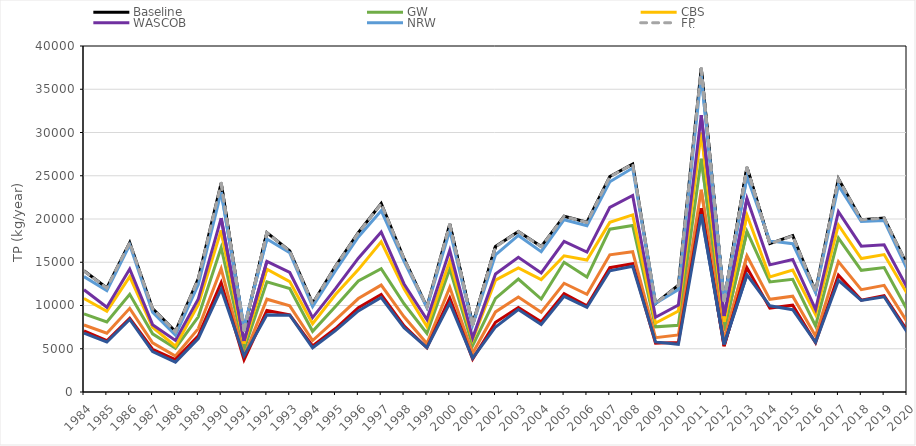
| Category | Baseline | GW | CBS | WASCOB | NRW | FP | GW + CBS | GW + CBS + WASCOB | All ACPs |
|---|---|---|---|---|---|---|---|---|---|
| 1984.0 | 14010 | 9039 | 10810 | 11820 | 13340 | 13980 | 7742 | 7065 | 6810 |
| 1985.0 | 12020 | 8093 | 9334 | 9793 | 11710 | 12010 | 6803 | 5930 | 5781 |
| 1986.0 | 17280 | 11290 | 13340 | 14220 | 17010 | 17270 | 9673 | 8518 | 8387 |
| 1987.0 | 9638 | 6727 | 7483 | 7781 | 9219 | 9616 | 5691 | 4943 | 4678 |
| 1988.0 | 6975 | 5066 | 5292 | 5964 | 6562 | 6956 | 4160 | 3754 | 3452 |
| 1989.0 | 13100 | 8697 | 10100 | 10750 | 12420 | 13070 | 7329 | 6490 | 6171 |
| 1990.0 | 24150 | 16700 | 18690 | 20100 | 23130 | 24120 | 14250 | 12640 | 11890 |
| 1991.0 | 7131 | 4880 | 5572 | 5904 | 7473 | 7137 | 4134 | 3717 | 4168 |
| 1992.0 | 18430 | 12740 | 14200 | 15100 | 17690 | 18400 | 10730 | 9420 | 8922 |
| 1993.0 | 16300 | 11960 | 12760 | 13820 | 16090 | 16280 | 9958 | 8925 | 8885 |
| 1994.0 | 10240 | 7014 | 7889 | 8604 | 9888 | 10220 | 5950 | 5333 | 5116 |
| 1995.0 | 14540 | 9875 | 11270 | 11950 | 14020 | 14510 | 8327 | 7335 | 7100 |
| 1996.0 | 18420 | 12840 | 14150 | 15470 | 17920 | 18390 | 10800 | 9740 | 9375 |
| 1997.0 | 21790 | 14260 | 17360 | 18500 | 20960 | 21770 | 12360 | 11270 | 10920 |
| 1998.0 | 15410 | 10200 | 11930 | 12490 | 15110 | 15390 | 8690 | 7643 | 7444 |
| 1999.0 | 9836 | 6784 | 7563 | 8385 | 9765 | 9836 | 5597 | 5112 | 5143 |
| 2000.0 | 19410 | 14250 | 15130 | 16380 | 18690 | 19370 | 12100 | 10870 | 10280 |
| 2001.0 | 7782 | 5372 | 6044 | 6259 | 7726 | 7784 | 4478 | 3812 | 3916 |
| 2002.0 | 16820 | 10830 | 12930 | 13640 | 15850 | 16770 | 9257 | 8066 | 7518 |
| 2003.0 | 18560 | 13060 | 14340 | 15570 | 18100 | 18540 | 10980 | 9766 | 9525 |
| 2004.0 | 16810 | 10750 | 13000 | 13760 | 16220 | 16790 | 9218 | 8118 | 7799 |
| 2005.0 | 20310 | 15000 | 15750 | 17410 | 19920 | 20300 | 12570 | 11360 | 11050 |
| 2006.0 | 19630 | 13290 | 15260 | 16170 | 19220 | 19610 | 11300 | 9975 | 9786 |
| 2007.0 | 24910 | 18820 | 19610 | 21350 | 24300 | 24880 | 15860 | 14370 | 14010 |
| 2008.0 | 26340 | 19250 | 20470 | 22720 | 25890 | 26330 | 16210 | 14820 | 14530 |
| 2009.0 | 10230 | 7538 | 7964 | 8636 | 10250 | 10220 | 6278 | 5628 | 5793 |
| 2010.0 | 12340 | 7708 | 9366 | 10060 | 11850 | 12310 | 6598 | 5732 | 5507 |
| 2011.0 | 37420 | 26960 | 29980 | 32000 | 36580 | 37400 | 23390 | 21230 | 20540 |
| 2012.0 | 10550 | 7126 | 8131 | 8781 | 10630 | 10550 | 6002 | 5301 | 5503 |
| 2013.0 | 25960 | 18560 | 20460 | 22370 | 24890 | 25930 | 15740 | 14360 | 13550 |
| 2014.0 | 17150 | 12720 | 13300 | 14700 | 17470 | 17140 | 10710 | 9699 | 9968 |
| 2015.0 | 18080 | 13030 | 14100 | 15320 | 17140 | 18040 | 11080 | 10040 | 9516 |
| 2016.0 | 11630 | 7645 | 8942 | 9540 | 11490 | 11610 | 6478 | 5692 | 5738 |
| 2017.0 | 24650 | 17800 | 19310 | 20840 | 23880 | 24620 | 15080 | 13500 | 12900 |
| 2018.0 | 19920 | 14070 | 15430 | 16860 | 19720 | 19910 | 11830 | 10620 | 10580 |
| 2019.0 | 20110 | 14390 | 15890 | 17030 | 19820 | 20100 | 12330 | 11150 | 11010 |
| 2020.0 | 14730 | 9528 | 11410 | 12110 | 14250 | 14720 | 8139 | 7152 | 6932 |